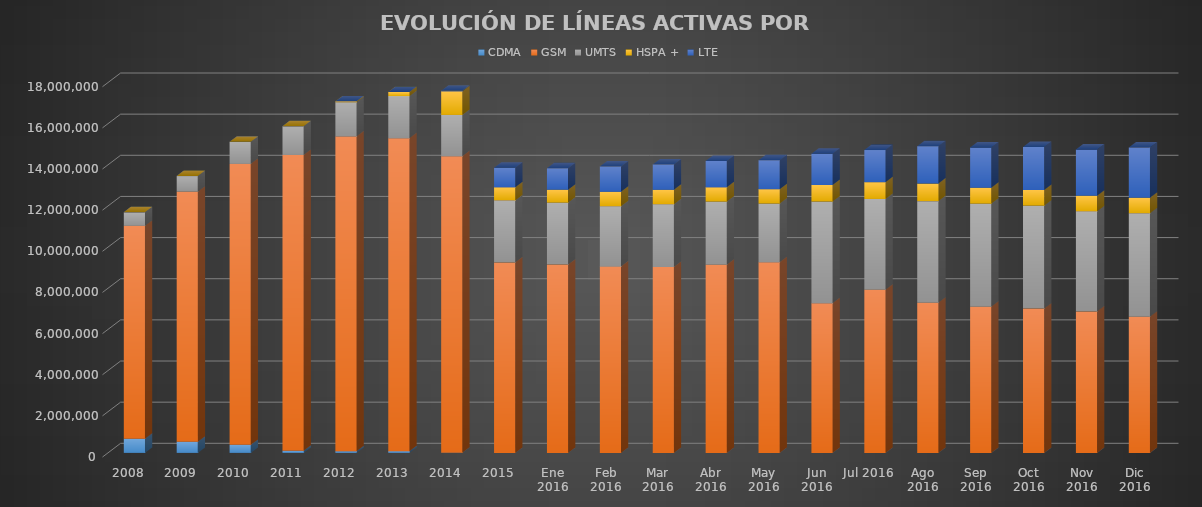
| Category | CDMA | GSM | UMTS | HSPA + | LTE |
|---|---|---|---|---|---|
| 2008 | 688357 | 10346902 | 656989 | 0 | 0 |
| 2009 | 544313 | 12151710 | 758577 | 0 | 0 |
| 2010 | 389834 | 13657394 | 1071603 | 0 | 0 |
| 2011 | 102115 | 14379423 | 1393020 | 0 | 0 |
| 2012 | 75179 | 15310006 | 1658596 | 43082 | 0 |
| 2013 | 83748 | 15215287 | 2043321 | 199398 | 0 |
| 2014 | 3009 | 14418144 | 2006405 | 1148823 | 28176 |
| 2015 | 0 | 9252920 | 3019889 | 636488 | 949723 |
| Ene 2016 | 0 | 9151434 | 3014450 | 624647 | 1043430 |
| Feb 2016 | 0 | 9060717 | 2926831 | 701642 | 1233429 |
| Mar 2016 | 0 | 9039373 | 3046404 | 700383 | 1236509 |
| Abr 2016 | 0 | 9142187 | 3074932 | 692454 | 1281921 |
| May 2016 | 0 | 9271274 | 2848793 | 698157 | 1408813 |
| Jun 2016 | 0 | 7271608 | 4947300 | 802451 | 1518705 |
| Jul 2016 | 0 | 7928586 | 4415084 | 816197 | 1561638 |
| Ago 2016 | 0 | 7294185 | 4943288 | 853938 | 1816804 |
| Sep 2016 | 0 | 7107870 | 5008550 | 769882 | 1958347 |
| Oct 2016 | 0 | 7013503 | 5005134 | 762617 | 2093121 |
| Nov 2016 | 0 | 6868263 | 4873170 | 754176 | 2246814 |
| Dic 2016 | 0 | 6621574 | 5027714 | 748032 | 2450814 |